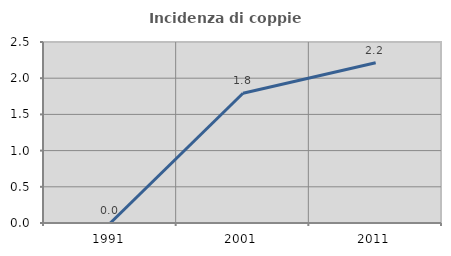
| Category | Incidenza di coppie miste |
|---|---|
| 1991.0 | 0 |
| 2001.0 | 1.793 |
| 2011.0 | 2.213 |